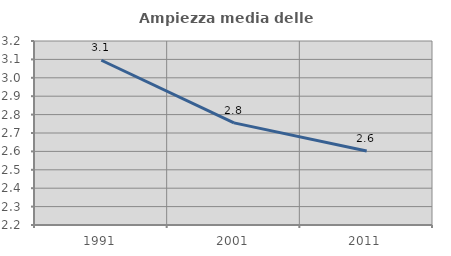
| Category | Ampiezza media delle famiglie |
|---|---|
| 1991.0 | 3.095 |
| 2001.0 | 2.755 |
| 2011.0 | 2.602 |